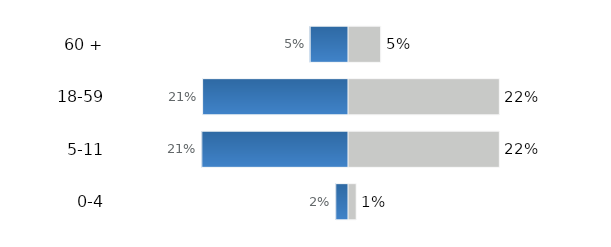
| Category | Series 0 | Series 1 |
|---|---|---|
| 60 + | 0.048 | -0.055 |
| 18-59 | 0.221 | -0.212 |
| 5-11 | 0.221 | -0.213 |
| 0-4 | 0.012 | -0.017 |